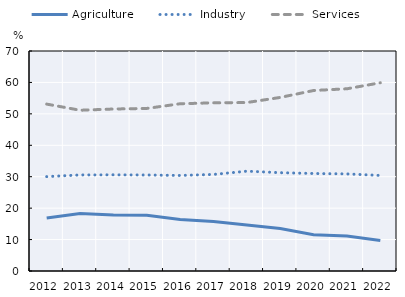
| Category | Agriculture | Industry | Services |
|---|---|---|---|
| 2012.0 | 16.86 | 30.032 | 53.108 |
| 2013.0 | 18.274 | 30.56 | 51.153 |
| 2014.0 | 17.852 | 30.603 | 51.542 |
| 2015.0 | 17.716 | 30.55 | 51.723 |
| 2016.0 | 16.384 | 30.398 | 53.215 |
| 2017.0 | 15.757 | 30.727 | 53.509 |
| 2018.0 | 14.628 | 31.767 | 53.6 |
| 2019.0 | 13.489 | 31.282 | 55.229 |
| 2020.0 | 11.554 | 31.016 | 57.43 |
| 2021.0 | 11.131 | 30.889 | 57.98 |
| 2022.0 | 9.702 | 30.399 | 59.894 |